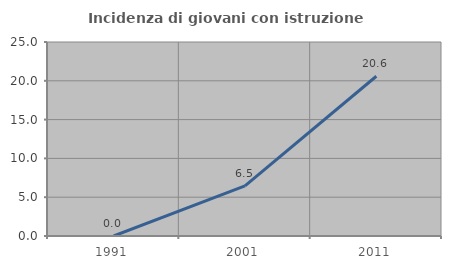
| Category | Incidenza di giovani con istruzione universitaria |
|---|---|
| 1991.0 | 0 |
| 2001.0 | 6.452 |
| 2011.0 | 20.588 |